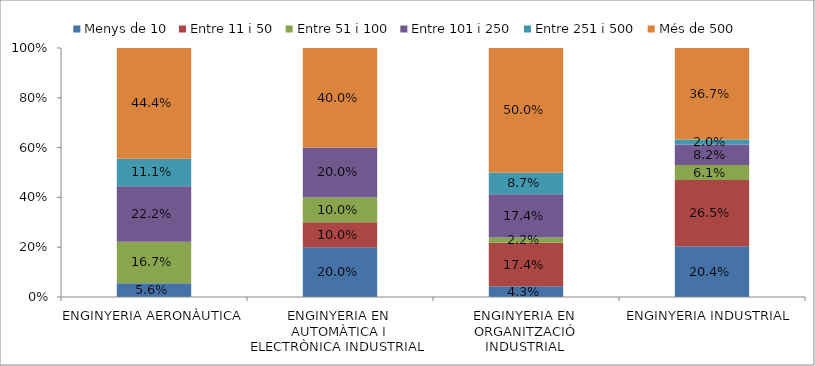
| Category | Menys de 10 | Entre 11 i 50 | Entre 51 i 100 | Entre 101 i 250 | Entre 251 i 500 | Més de 500 |
|---|---|---|---|---|---|---|
| ENGINYERIA AERONÀUTICA | 0.056 | 0 | 0.167 | 0.222 | 0.111 | 0.444 |
| ENGINYERIA EN AUTOMÀTICA I ELECTRÒNICA INDUSTRIAL | 0.2 | 0.1 | 0.1 | 0.2 | 0 | 0.4 |
| ENGINYERIA EN ORGANITZACIÓ INDUSTRIAL | 0.043 | 0.174 | 0.022 | 0.174 | 0.087 | 0.5 |
| ENGINYERIA INDUSTRIAL | 0.204 | 0.265 | 0.061 | 0.082 | 0.02 | 0.367 |